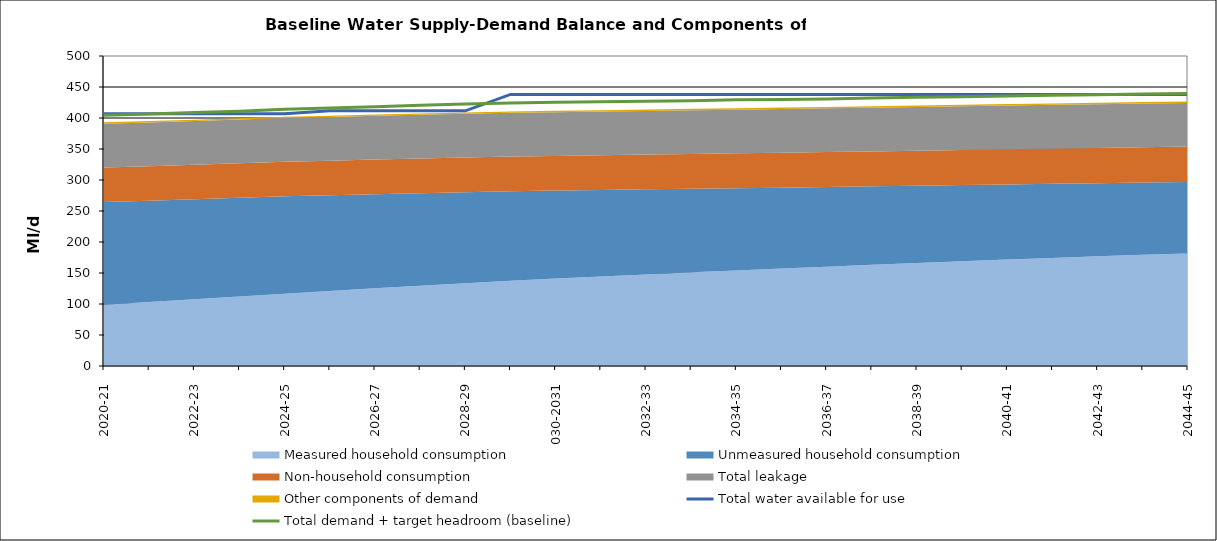
| Category | Total water available for use | Total demand + target headroom (baseline) |
|---|---|---|
| 0 | 406.688 | 404.548 |
| 1 | 406.688 | 406.578 |
| 2 | 406.688 | 408.694 |
| 3 | 406.688 | 411.076 |
| 4 | 406.688 | 413.929 |
| 5 | 411.51 | 416.228 |
| 6 | 411.51 | 418.241 |
| 7 | 411.51 | 420.409 |
| 8 | 411.51 | 422.497 |
| 9 | 438.052 | 424.28 |
| 10 | 438.052 | 425.358 |
| 11 | 438.052 | 426.161 |
| 12 | 438.052 | 427.071 |
| 13 | 438.052 | 427.876 |
| 14 | 438.052 | 429.239 |
| 15 | 438.052 | 429.904 |
| 16 | 438.052 | 430.573 |
| 17 | 438.052 | 432.194 |
| 18 | 438.052 | 433.29 |
| 19 | 438.052 | 434.458 |
| 20 | 438.052 | 435.356 |
| 21 | 438.052 | 436.622 |
| 22 | 438.052 | 437.521 |
| 23 | 438.052 | 438.899 |
| 24 | 438.052 | 439.649 |